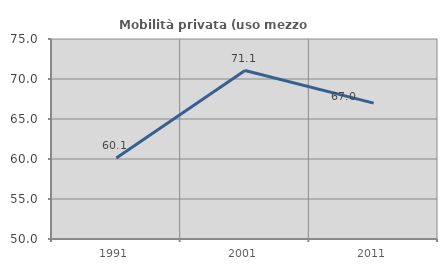
| Category | Mobilità privata (uso mezzo privato) |
|---|---|
| 1991.0 | 60.133 |
| 2001.0 | 71.053 |
| 2011.0 | 66.987 |